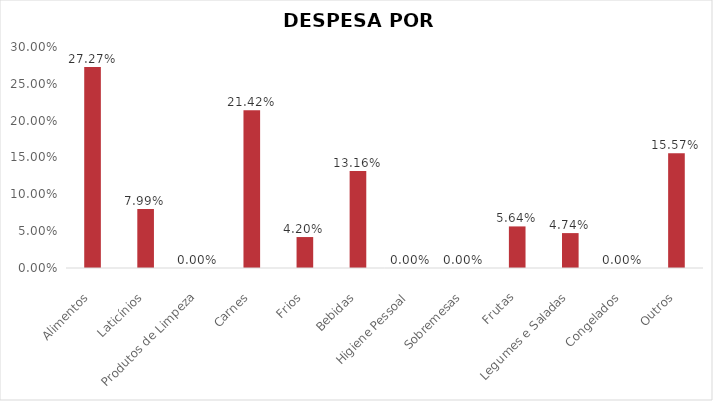
| Category | Series 0 |
|---|---|
| Alimentos | 0.273 |
| Laticínios | 0.08 |
| Produtos de Limpeza | 0 |
| Carnes | 0.214 |
| Frios | 0.042 |
| Bebidas | 0.132 |
| Higiene Pessoal | 0 |
| Sobremesas | 0 |
| Frutas | 0.056 |
| Legumes e Saladas | 0.047 |
| Congelados | 0 |
| Outros | 0.156 |